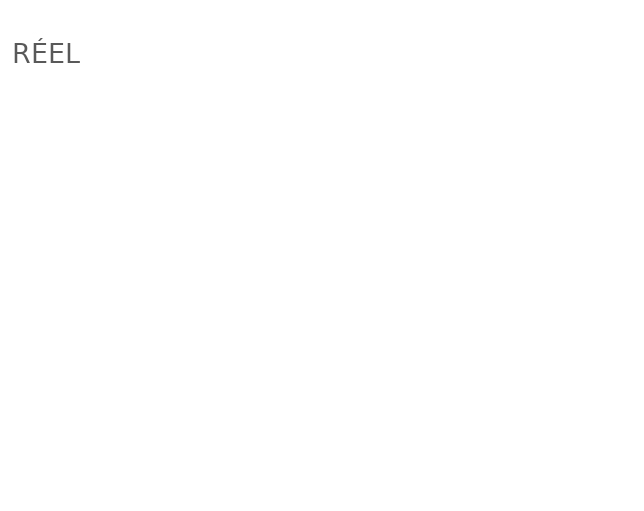
| Category | RÉEL |
|---|---|
| EMPLOI - PERMANENT | 0 |
| EMPLOI - OCCASIONNEL | 0 |
| GÉNÉRAL/ADMINISTRATIF | 0 |
| OPÉRATIONS | 0 |
| MARKETING/PROMOTION | 0 |
| SITE WEB/APPLICATION MOBILE | 0 |
| LOCAL | 0 |
| VÉHICULE | 0 |
| AUTRES | 0 |